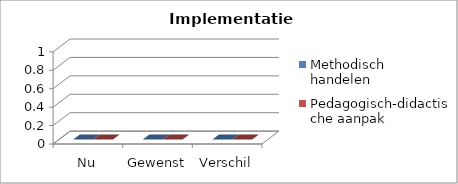
| Category | Methodisch handelen  | Pedagogisch-didactische aanpak |
|---|---|---|
| Nu | 0 | 0 |
| Gewenst | 0 | 0 |
| Verschil | 0 | 0 |